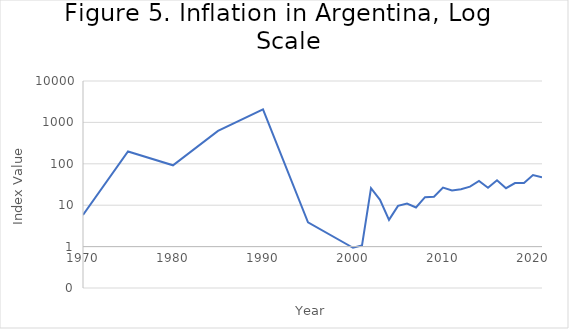
| Category | Inflation |
|---|---|
| 2021.0 | 47.1 |
| 2020.0 | 53.548 |
| 2019.0 | 34.3 |
| 2018.0 | 34.3 |
| 2017.0 | 25.7 |
| 2016.0 | 40 |
| 2015.0 | 26.38 |
| 2014.0 | 38.673 |
| 2013.0 | 28 |
| 2012.0 | 24.4 |
| 2011.0 | 22.81 |
| 2010.0 | 26.6 |
| 2009.0 | 16 |
| 2008.0 | 15.66 |
| 2007.0 | 8.831 |
| 2006.0 | 10.901 |
| 2005.0 | 9.639 |
| 2004.0 | 4.416 |
| 2003.0 | 13.442 |
| 2002.0 | 25.868 |
| 2001.0 | 1.067 |
| 2000.0 | 0.936 |
| 1995.0 | 3.87 |
| 1990.0 | 2064.19 |
| 1985.0 | 620.84 |
| 1980.0 | 92.02 |
| 1975.0 | 198.22 |
| 1970.0 | 5.8 |